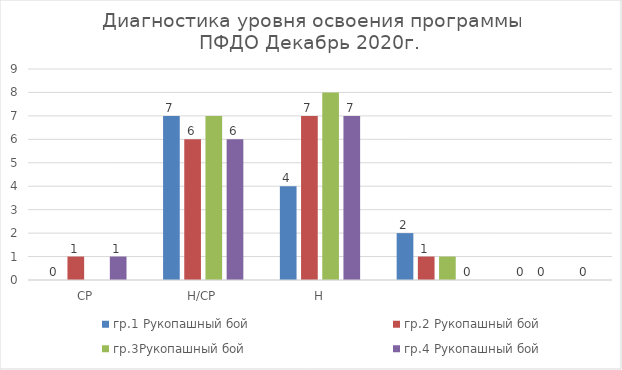
| Category | гр.1 Рукопашный бой | гр.2 Рукопашный бой | гр.3Рукопашный бой | гр.4 Рукопашный бой |
|---|---|---|---|---|
| СР | 0 | 1 | 0 | 1 |
| Н/СР | 7 | 6 | 7 | 6 |
| Н | 4 | 7 | 8 | 7 |